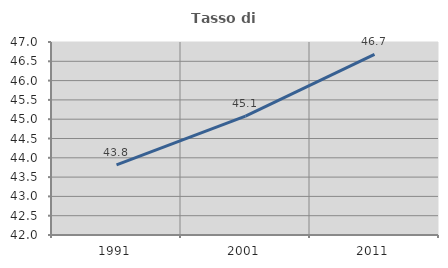
| Category | Tasso di occupazione   |
|---|---|
| 1991.0 | 43.817 |
| 2001.0 | 45.08 |
| 2011.0 | 46.682 |